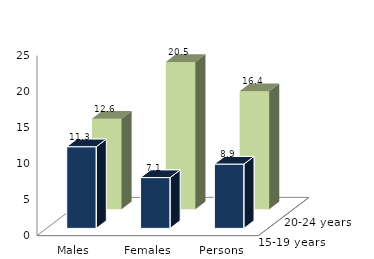
| Category | 15-19 years | 20-24 years |
|---|---|---|
| Males | 11.346 | 12.572 |
| Females | 7.059 | 20.464 |
| Persons | 8.935 | 16.397 |